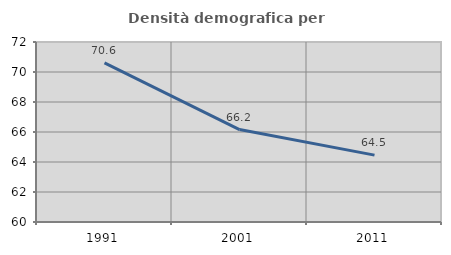
| Category | Densità demografica |
|---|---|
| 1991.0 | 70.611 |
| 2001.0 | 66.161 |
| 2011.0 | 64.46 |